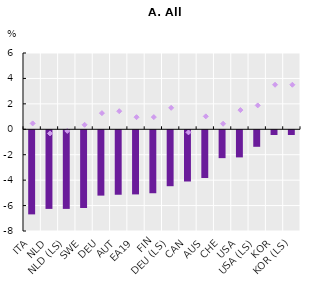
| Category | 2022 (↗) |
|---|---|
| ITA | -6.614 |
| NLD | -6.183 |
| NLD (LS) | -6.183 |
| SWE | -6.112 |
| DEU | -5.139 |
| AUT | -5.07 |
| EA19 | -5.043 |
| FIN | -4.951 |
| DEU (LS) | -4.398 |
| CAN | -4.029 |
| AUS | -3.751 |
| CHE | -2.191 |
| USA | -2.132 |
| USA (LS) | -1.299 |
| KOR | -0.369 |
| KOR (LS) | -0.369 |